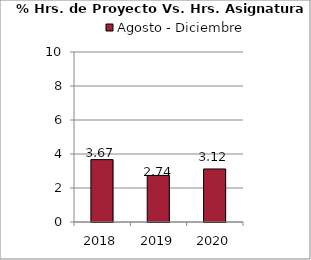
| Category | Agosto - Diciembre |
|---|---|
| 2018.0 | 3.67 |
| 2019.0 | 2.74 |
| 2020.0 | 3.12 |